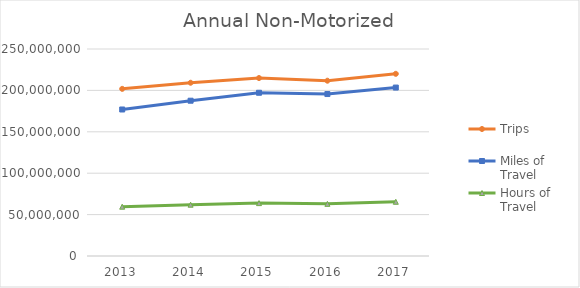
| Category | Trips | Miles of Travel | Hours of Travel |
|---|---|---|---|
| 2013 | 201855871.958 | 176938360.899 | 59555512.671 |
| 2014 | 209248643.078 | 187547577.286 | 61952496.485 |
| 2015 | 214917054.12 | 197155669.738 | 63867402.676 |
| 2016 | 211708897.601 | 195609357.793 | 62987032.866 |
| 2017 | 220027911.685 | 203415624.606 | 65468348.368 |